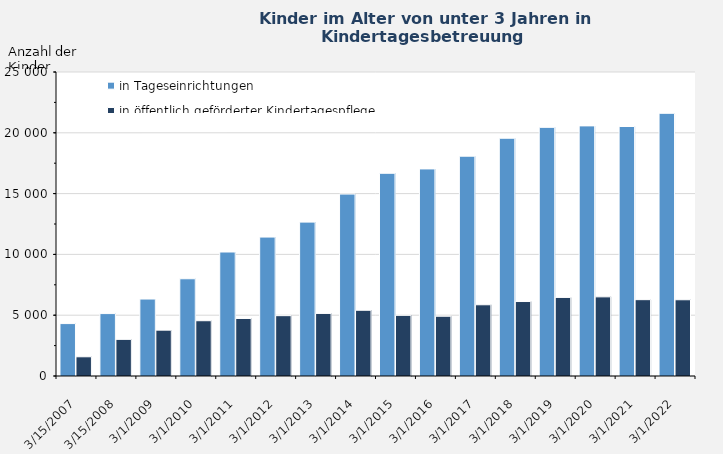
| Category | in Tageseinrichtungen | in öffentlich geförderter Kindertagespflege 
(„Tagesmütter/ -väter“) |
|---|---|---|
| 3/15/07 | 4310 | 1580 |
| 3/15/08 | 5133 | 3013 |
| 3/1/09 | 6329 | 3770 |
| 3/1/10 | 7997 | 4545 |
| 3/1/11 | 10197 | 4731 |
| 3/1/12 | 11425 | 4962 |
| 3/1/13 | 12655 | 5146 |
| 3/1/14 | 14961 | 5405 |
| 3/1/15 | 16670 | 4987 |
| 3/1/16 | 17029 | 4915 |
| 3/1/17 | 18076 | 5857 |
| 3/1/18 | 19553 | 6125 |
| 3/1/19 | 20448 | 6461 |
| 3/1/20 | 20569 | 6509 |
| 3/1/21 | 20518 | 6278 |
| 3/1/22 | 21603 | 6270 |